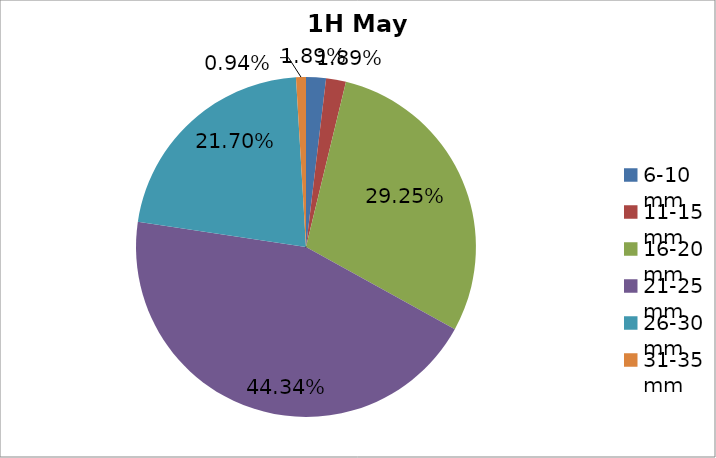
| Category | Series 0 |
|---|---|
| 6-10 mm | 0.019 |
| 11-15 mm | 0.019 |
| 16-20 mm | 0.292 |
| 21-25 mm | 0.443 |
| 26-30 mm | 0.217 |
| 31-35 mm | 0.009 |